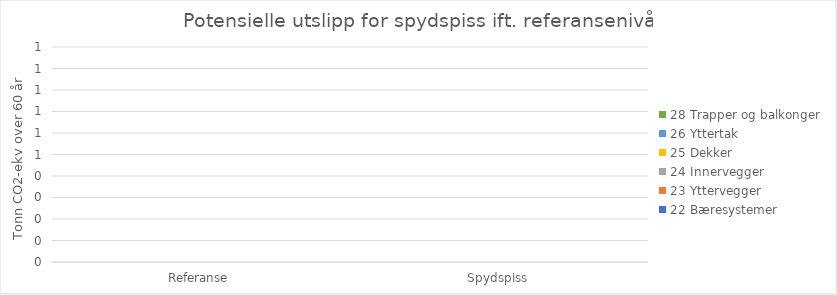
| Category | 22 Bæresystemer | 23 Yttervegger | 24 Innervegger | 25 Dekker | 26 Yttertak | 28 Trapper og balkonger |
|---|---|---|---|---|---|---|
| Referanse | 0 | 0 | 0 | 0 | 0 | 0 |
| Spydspiss | 0 | 0 | 0 | 0 | 0 | 0 |